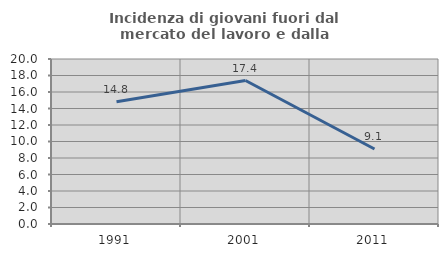
| Category | Incidenza di giovani fuori dal mercato del lavoro e dalla formazione  |
|---|---|
| 1991.0 | 14.815 |
| 2001.0 | 17.391 |
| 2011.0 | 9.091 |